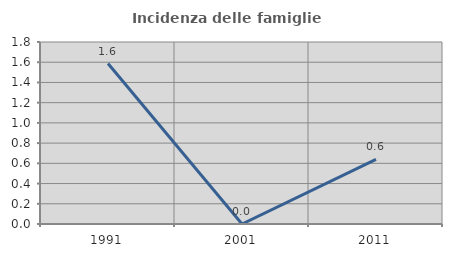
| Category | Incidenza delle famiglie numerose |
|---|---|
| 1991.0 | 1.587 |
| 2001.0 | 0 |
| 2011.0 | 0.639 |